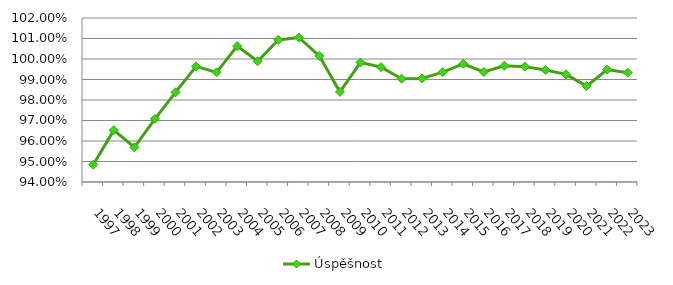
| Category | Úspěšnost |
|---|---|
| 1997.0 | 0.948 |
| 1998.0 | 0.965 |
| 1999.0 | 0.957 |
| 2000.0 | 0.971 |
| 2001.0 | 0.984 |
| 2002.0 | 0.996 |
| 2003.0 | 0.993 |
| 2004.0 | 1.006 |
| 2005.0 | 0.999 |
| 2006.0 | 1.009 |
| 2007.0 | 1.01 |
| 2008.0 | 1.002 |
| 2009.0 | 0.984 |
| 2010.0 | 0.998 |
| 2011.0 | 0.996 |
| 2012.0 | 0.99 |
| 2013.0 | 0.991 |
| 2014.0 | 0.994 |
| 2015.0 | 0.998 |
| 2016.0 | 0.994 |
| 2017.0 | 0.997 |
| 2018.0 | 0.996 |
| 2019.0 | 0.995 |
| 2020.0 | 0.992 |
| 2021.0 | 0.987 |
| 2022.0 | 0.995 |
| 2023.0 | 0.993 |